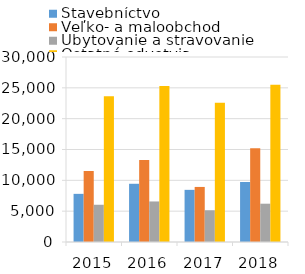
| Category | Stavebníctvo | Veľko- a maloobchod | Ubytovanie a stravovanie | Ostatné odvetvia |
|---|---|---|---|---|
| 2015.0 | 7807 | 11512 | 6040 | 23655 |
| 2016.0 | 9442 | 13296 | 6575 | 25290 |
| 2017.0 | 8456 | 8929 | 5148 | 22597 |
| 2018.0 | 9732 | 15192 | 6211 | 25501 |